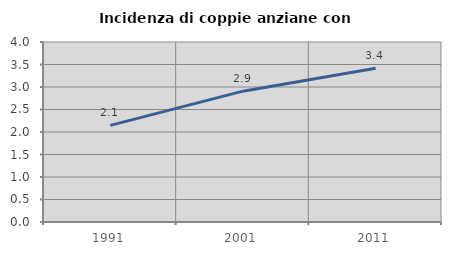
| Category | Incidenza di coppie anziane con figli |
|---|---|
| 1991.0 | 2.146 |
| 2001.0 | 2.908 |
| 2011.0 | 3.416 |